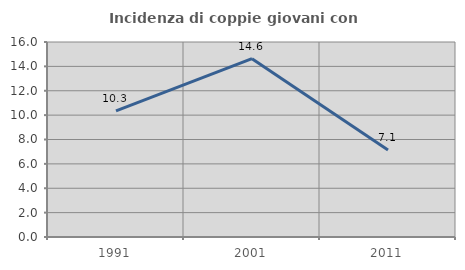
| Category | Incidenza di coppie giovani con figli |
|---|---|
| 1991.0 | 10.345 |
| 2001.0 | 14.634 |
| 2011.0 | 7.143 |